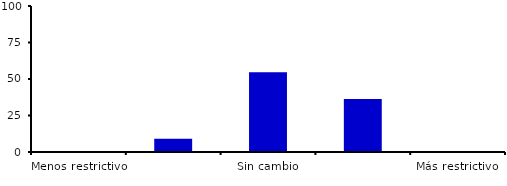
| Category | Series 0 |
|---|---|
| Menos restrictivo | 0 |
| Moderadamente menos restrictivo | 9.091 |
| Sin cambio | 54.545 |
| Moderadamente más restrictivo | 36.364 |
| Más restrictivo | 0 |